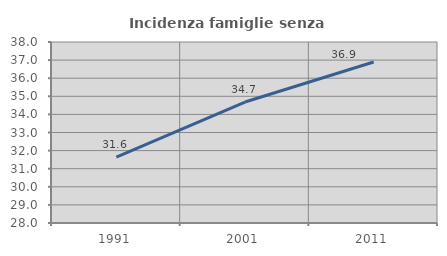
| Category | Incidenza famiglie senza nuclei |
|---|---|
| 1991.0 | 31.641 |
| 2001.0 | 34.682 |
| 2011.0 | 36.896 |